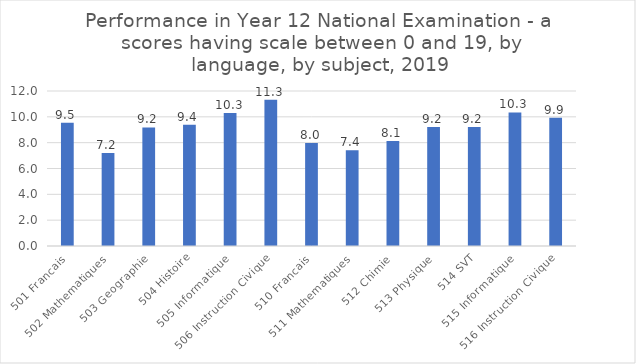
| Category | Series 0 |
|---|---|
| 501 Francais | 9.542 |
| 502 Mathematiques | 7.203 |
| 503 Geographie | 9.177 |
| 504 Histoire | 9.387 |
| 505 Informatique | 10.303 |
| 506 Instruction Civique | 11.332 |
| 510 Francais | 7.966 |
| 511 Mathematiques | 7.405 |
| 512 Chimie | 8.125 |
| 513 Physique | 9.207 |
| 514 SVT | 9.22 |
| 515 Informatique | 10.336 |
| 516 Instruction Civique | 9.922 |